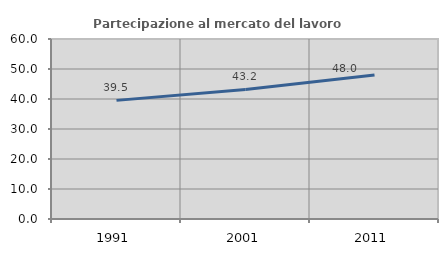
| Category | Partecipazione al mercato del lavoro  femminile |
|---|---|
| 1991.0 | 39.542 |
| 2001.0 | 43.193 |
| 2011.0 | 47.996 |